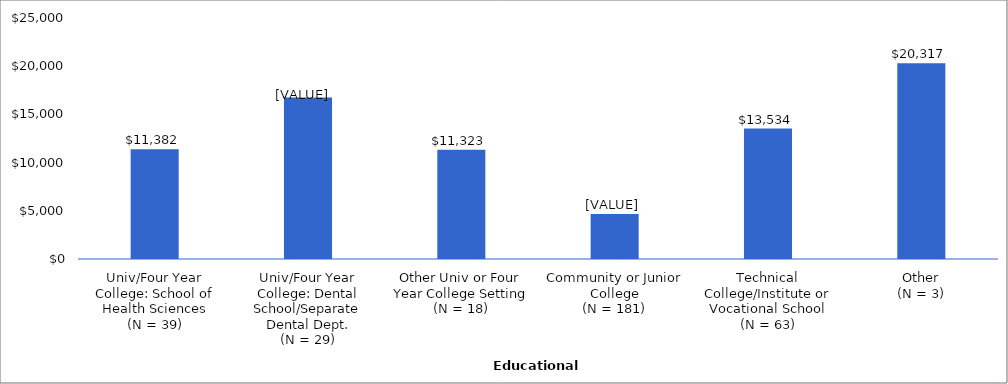
| Category | Series 0 |
|---|---|
| Univ/Four Year College: School of Health Sciences
(N = 39) | 11382 |
| Univ/Four Year College: Dental School/Separate Dental Dept.
(N = 29) | 16755.79 |
| Other Univ or Four Year College Setting
(N = 18) | 11323 |
| Community or Junior College
(N = 181) | 4666 |
| Technical College/Institute or Vocational School
(N = 63) | 13534 |
| Other
(N = 3) | 20317 |